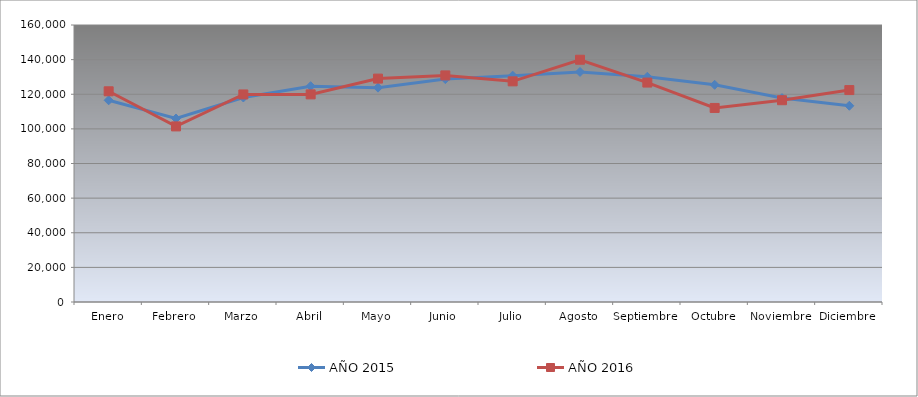
| Category | AÑO 2015 | AÑO 2016 |
|---|---|---|
| Enero | 116507.053 | 121712.863 |
| Febrero | 105993.892 | 101434.276 |
| Marzo | 118125.206 | 119891.152 |
| Abril | 124668.295 | 119921.468 |
| Mayo | 123817.072 | 129038.289 |
| Junio | 128747.534 | 130882.047 |
| Julio | 130737.407 | 127453.593 |
| Agosto | 132879.284 | 139938.236 |
| Septiembre | 130093.462 | 126748.06 |
| Octubre | 125461.481 | 112091.696 |
| Noviembre | 117782.506 | 116557.78 |
| Diciembre | 113345.366 | 122418.397 |